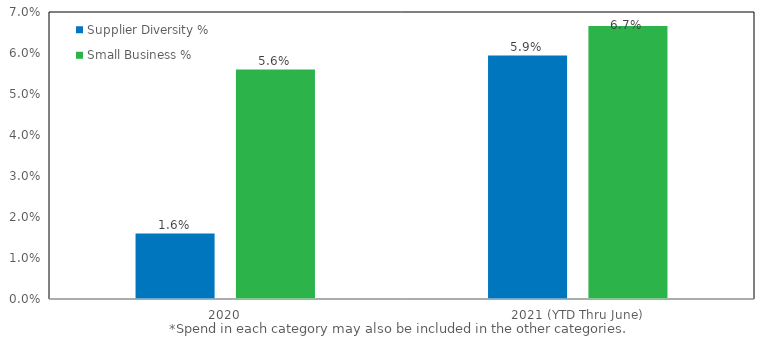
| Category | Supplier Diversity % | Small Business % |
|---|---|---|
| 2020 | 0.016 | 0.056 |
| 2021 (YTD Thru June) | 0.059 | 0.067 |